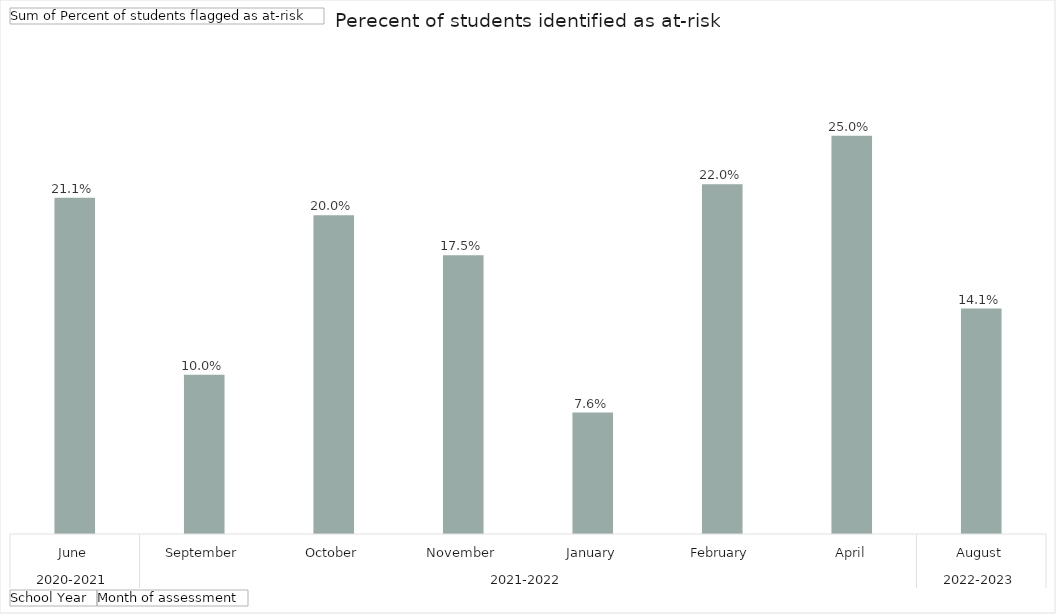
| Category | Total |
|---|---|
| 0 | 0.211 |
| 1 | 0.1 |
| 2 | 0.2 |
| 3 | 0.175 |
| 4 | 0.076 |
| 5 | 0.22 |
| 6 | 0.25 |
| 7 | 0.141 |